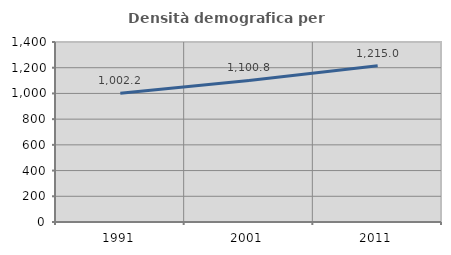
| Category | Densità demografica |
|---|---|
| 1991.0 | 1002.157 |
| 2001.0 | 1100.791 |
| 2011.0 | 1214.953 |